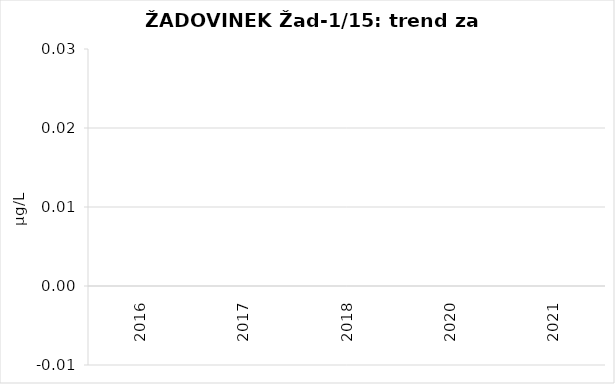
| Category | Vsota |
|---|---|
| 2016 | 0 |
| 2017 | 0 |
| 2018 | 0 |
| 2020 | 0 |
| 2021 | 0 |